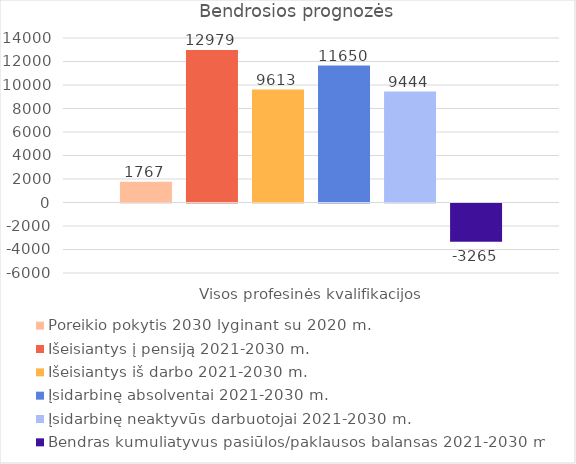
| Category | Poreikio pokytis 2030 lyginant su 2020 m. | Išeisiantys į pensiją 2021-2030 m. | Išeisiantys iš darbo 2021-2030 m. | Įsidarbinę absolventai 2021-2030 m. | Įsidarbinę neaktyvūs darbuotojai 2021-2030 m. | Bendras kumuliatyvus pasiūlos/paklausos balansas 2021-2030 m. |
|---|---|---|---|---|---|---|
| Visos profesinės kvalifikacijos | 1766.921 | 12979.167 | 9612.708 | 11650.242 | 9443.889 | -3264.665 |